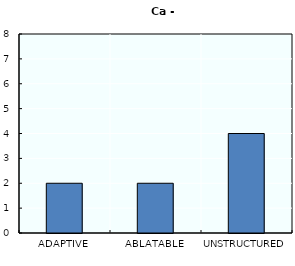
| Category | Series 0 |
|---|---|
| ADAPTIVE | 2 |
| ABLATABLE | 2 |
| UNSTRUCTURED | 4 |